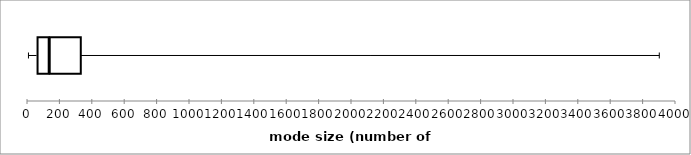
| Category | series 1 | series 2 | series 3 | series 4 |
|---|---|---|---|---|
| model size (number of instances) | 2 | 57 | 75 | 198 |